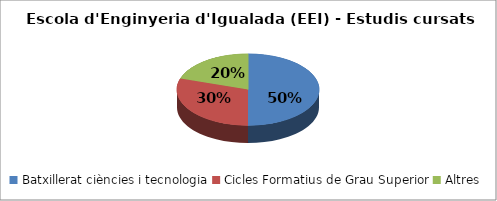
| Category | Escola d'Enginyeria d'Igualada (EEI) - Estudis cursats |
|---|---|
| Batxillerat ciències i tecnologia | 0.5 |
| Cicles Formatius de Grau Superior | 0.3 |
| Altres | 0.2 |